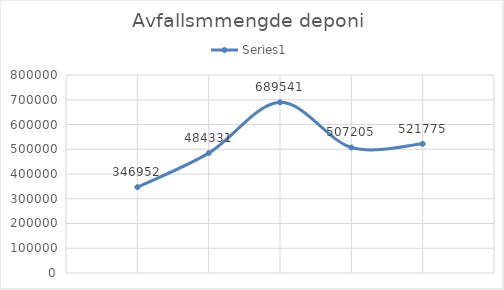
| Category | Series 0 |
|---|---|
| 0 | 346952 |
| 1 | 484331 |
| 2 | 689541 |
| 3 | 507205 |
| 4 | 521775 |